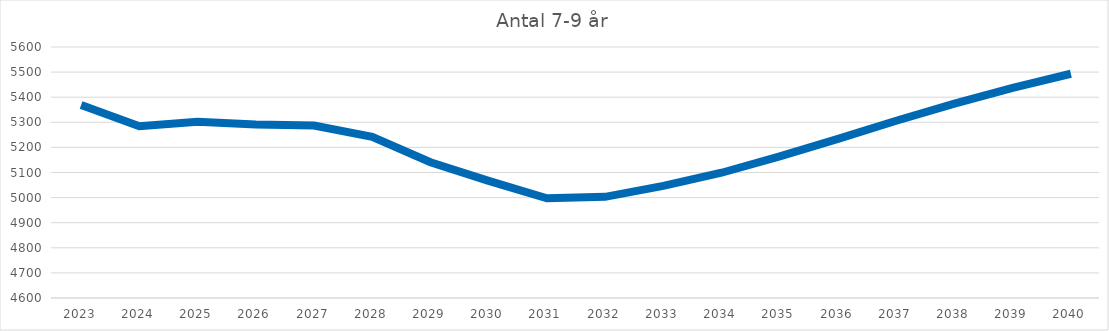
| Category | Antal 7-9 år |
|---|---|
| 2023.0 | 5369 |
| 2024.0 | 5284.551 |
| 2025.0 | 5301.963 |
| 2026.0 | 5291.344 |
| 2027.0 | 5287.402 |
| 2028.0 | 5242.519 |
| 2029.0 | 5140.761 |
| 2030.0 | 5066.774 |
| 2031.0 | 4997.412 |
| 2032.0 | 5003.032 |
| 2033.0 | 5046.561 |
| 2034.0 | 5099.067 |
| 2035.0 | 5164.586 |
| 2036.0 | 5233.995 |
| 2037.0 | 5306.268 |
| 2038.0 | 5374.316 |
| 2039.0 | 5437.305 |
| 2040.0 | 5493.414 |